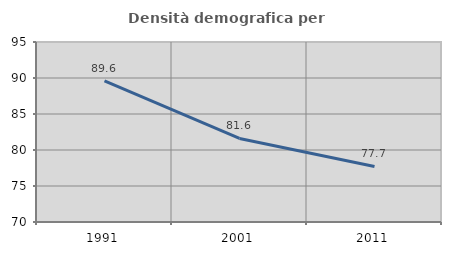
| Category | Densità demografica |
|---|---|
| 1991.0 | 89.612 |
| 2001.0 | 81.6 |
| 2011.0 | 77.714 |